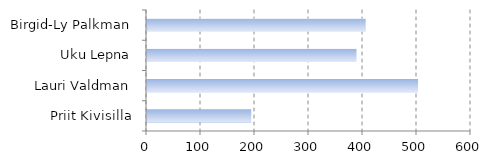
| Category | Series 0 |
|---|---|
| Priit Kivisilla | 193 |
| Lauri Valdman | 502 |
| Uku Lepna | 388 |
| Birgid-Ly Palkman | 405 |